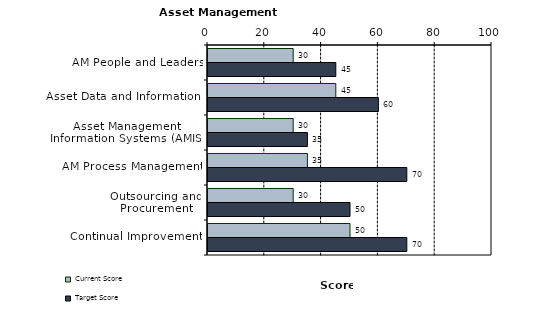
| Category | Current Score | Target Score |
|---|---|---|
| AM People and Leaders | 30 | 45 |
| Asset Data and Information  | 45 | 60 |
| Asset Management Information Systems (AMIS) | 30 | 35 |
| AM Process Management | 35 | 70 |
| Outsourcing and Procurement | 30 | 50 |
| Continual Improvement | 50 | 70 |